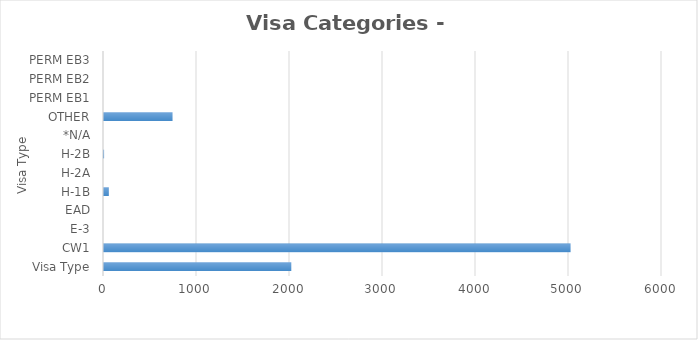
| Category | Series 0 |
|---|---|
| Visa Type | 2014 |
| CW1 | 5017 |
| E-3 | 0 |
| EAD | 0 |
| H-1B | 52 |
| H-2A | 0 |
| H-2B | 1 |
| *N/A | 0 |
| OTHER | 737 |
| PERM EB1 | 0 |
| PERM EB2 | 0 |
| PERM EB3 | 0 |